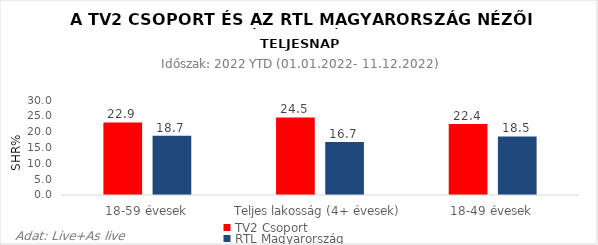
| Category | TV2 Csoport | RTL Magyarország |
|---|---|---|
| 18-59 évesek | 22.9 | 18.7 |
| Teljes lakosság (4+ évesek) | 24.5 | 16.7 |
| 18-49 évesek | 22.4 | 18.5 |